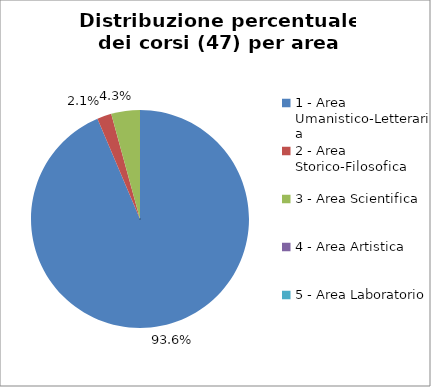
| Category | Nr. Corsi |
|---|---|
| 1 - Area Umanistico-Letteraria | 44 |
| 2 - Area Storico-Filosofica | 1 |
| 3 - Area Scientifica | 2 |
| 4 - Area Artistica | 0 |
| 5 - Area Laboratorio | 0 |